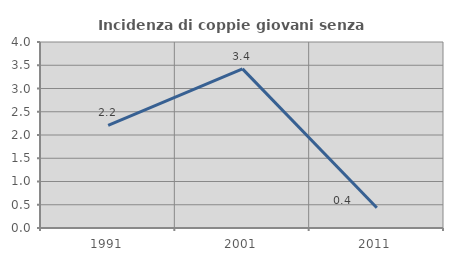
| Category | Incidenza di coppie giovani senza figli |
|---|---|
| 1991.0 | 2.206 |
| 2001.0 | 3.422 |
| 2011.0 | 0.437 |